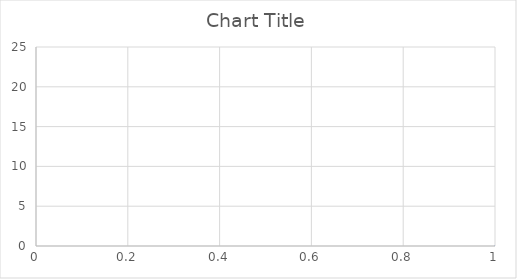
| Category | Series 0 |
|---|---|
| 0 | 0 |
| 1 | 19.247 |
| 2 | 19.247 |
| 3 | 19.247 |
| 4 | 19.248 |
| 5 | 19.25 |
| 6 | 19.25 |
| 7 | 19.251 |
| 8 | 19.252 |
| 9 | 19.252 |
| 10 | 19.249 |
| 11 | 19.247 |
| 12 | 19.241 |
| 13 | 19.245 |
| 14 | 19.249 |
| 15 | 19.249 |
| 16 | 19.249 |
| 17 | 19.249 |
| 18 | 19.249 |
| 19 | 19.249 |
| 20 | 19.249 |
| 21 | 19.249 |
| 22 | 19.249 |
| 23 | 19.249 |
| 24 | 19.249 |
| 25 | 19.249 |
| 26 | 19.249 |
| 27 | 19.25 |
| 28 | 19.251 |
| 29 | 19.251 |
| 30 | 19.249 |
| 31 | 19.246 |
| 32 | 19.246 |
| 33 | 19.25 |
| 34 | 19.254 |
| 35 | 19.248 |
| 36 | 19.248 |
| 37 | 19.248 |
| 38 | 19.251 |
| 39 | 19.254 |
| 40 | 19.257 |
| 41 | 19.249 |
| 42 | 19.248 |
| 43 | 19.247 |
| 44 | 19.252 |
| 45 | 19.251 |
| 46 | 19.25 |
| 47 | 19.25 |
| 48 | 19.25 |
| 49 | 19.25 |
| 50 | 19.248 |
| 51 | 19.247 |
| 52 | 19.255 |
| 53 | 19.252 |
| 54 | 19.25 |
| 55 | 19.25 |
| 56 | 19.251 |
| 57 | 19.252 |
| 58 | 19.252 |
| 59 | 19.252 |
| 60 | 19.252 |
| 61 | 19.252 |
| 62 | 19.252 |
| 63 | 19.252 |
| 64 | 19.247 |
| 65 | 19.248 |
| 66 | 19.249 |
| 67 | 19.249 |
| 68 | 19.249 |
| 69 | 19.249 |
| 70 | 19.251 |
| 71 | 19.251 |
| 72 | 19.251 |
| 73 | 19.251 |
| 74 | 19.251 |
| 75 | 19.251 |
| 76 | 19.252 |
| 77 | 19.254 |
| 78 | 19.254 |
| 79 | 19.254 |
| 80 | 19.254 |
| 81 | 19.254 |
| 82 | 19.254 |
| 83 | 19.254 |
| 84 | 19.254 |
| 85 | 19.254 |
| 86 | 19.254 |
| 87 | 19.254 |
| 88 | 19.251 |
| 89 | 19.248 |
| 90 | 19.248 |
| 91 | 19.25 |
| 92 | 19.251 |
| 93 | 19.251 |
| 94 | 19.251 |
| 95 | 19.251 |
| 96 | 19.251 |
| 97 | 19.251 |
| 98 | 19.251 |
| 99 | 19.248 |
| 100 | 19.245 |
| 101 | 19.251 |
| 102 | 19.251 |
| 103 | 19.251 |
| 104 | 19.251 |
| 105 | 19.251 |
| 106 | 19.251 |
| 107 | 19.251 |
| 108 | 19.251 |
| 109 | 19.251 |
| 110 | 19.251 |
| 111 | 19.251 |
| 112 | 19.245 |
| 113 | 19.248 |
| 114 | 19.249 |
| 115 | 19.25 |
| 116 | 19.253 |
| 117 | 19.25 |
| 118 | 19.247 |
| 119 | 19.245 |
| 120 | 19.246 |
| 121 | 19.247 |
| 122 | 19.249 |
| 123 | 19.248 |
| 124 | 19.247 |
| 125 | 19.248 |
| 126 | 19.249 |
| 127 | 19.252 |
| 128 | 19.249 |
| 129 | 19.246 |
| 130 | 19.249 |
| 131 | 19.246 |
| 132 | 19.244 |
| 133 | 19.246 |
| 134 | 19.246 |
| 135 | 19.246 |
| 136 | 19.249 |
| 137 | 19.249 |
| 138 | 19.249 |
| 139 | 19.246 |
| 140 | 19.247 |
| 141 | 19.249 |
| 142 | 19.251 |
| 143 | 19.249 |
| 144 | 19.246 |
| 145 | 19.246 |
| 146 | 19.246 |
| 147 | 19.246 |
| 148 | 19.249 |
| 149 | 19.249 |
| 150 | 19.249 |
| 151 | 19.25 |
| 152 | 19.251 |
| 153 | 19.246 |
| 154 | 19.246 |
| 155 | 19.246 |
| 156 | 19.241 |
| 157 | 19.248 |
| 158 | 19.248 |
| 159 | 19.248 |
| 160 | 19.251 |
| 161 | 19.254 |
| 162 | 19.246 |
| 163 | 19.246 |
| 164 | 19.246 |
| 165 | 19.246 |
| 166 | 19.246 |
| 167 | 19.246 |
| 168 | 19.246 |
| 169 | 19.247 |
| 170 | 19.248 |
| 171 | 19.243 |
| 172 | 19.245 |
| 173 | 19.246 |
| 174 | 19.249 |
| 175 | 19.249 |
| 176 | 19.249 |
| 177 | 19.25 |
| 178 | 19.251 |
| 179 | 19.246 |
| 180 | 19.247 |
| 181 | 19.249 |
| 182 | 19.244 |
| 183 | 19.247 |
| 184 | 19.251 |
| 185 | 19.246 |
| 186 | 19.244 |
| 187 | 19.241 |
| 188 | 19.249 |
| 189 | 19.246 |
| 190 | 19.244 |
| 191 | 19.244 |
| 192 | 19.244 |
| 193 | 19.244 |
| 194 | 19.246 |
| 195 | 19.246 |
| 196 | 19.246 |
| 197 | 19.246 |
| 198 | 19.245 |
| 199 | 19.244 |
| 200 | 19.239 |
| 201 | 19.242 |
| 202 | 19.246 |
| 203 | 19.246 |
| 204 | 19.246 |
| 205 | 19.246 |
| 206 | 19.246 |
| 207 | 19.246 |
| 208 | 19.239 |
| 209 | 19.245 |
| 210 | 19.251 |
| 211 | 19.251 |
| 212 | 19.249 |
| 213 | 19.246 |
| 214 | 19.246 |
| 215 | 19.249 |
| 216 | 19.252 |
| 217 | 19.244 |
| 218 | 19.244 |
| 219 | 19.244 |
| 220 | 19.251 |
| 221 | 19.249 |
| 222 | 19.246 |
| 223 | 19.246 |
| 224 | 19.248 |
| 225 | 19.249 |
| 226 | 19.244 |
| 227 | 19.244 |
| 228 | 19.244 |
| 229 | 19.245 |
| 230 | 19.247 |
| 231 | 19.249 |
| 232 | 19.249 |
| 233 | 19.249 |
| 234 | 19.252 |
| 235 | 19.25 |
| 236 | 19.247 |
| 237 | 19.255 |
| 238 | 19.252 |
| 239 | 19.25 |
| 240 | 19.25 |
| 241 | 19.25 |
| 242 | 19.25 |
| 243 | 19.25 |
| 244 | 19.25 |
| 245 | 19.25 |
| 246 | 19.25 |
| 247 | 19.246 |
| 248 | 19.242 |
| 249 | 19.242 |
| 250 | 19.246 |
| 251 | 19.25 |
| 252 | 19.25 |
| 253 | 19.25 |
| 254 | 19.25 |
| 255 | 19.25 |
| 256 | 19.25 |
| 257 | 19.245 |
| 258 | 19.245 |
| 259 | 19.245 |
| 260 | 19.252 |
| 261 | 19.252 |
| 262 | 19.252 |
| 263 | 19.252 |
| 264 | 19.252 |
| 265 | 19.252 |
| 266 | 19.245 |
| 267 | 19.247 |
| 268 | 19.25 |
| 269 | 19.25 |
| 270 | 19.25 |
| 271 | 19.25 |
| 272 | 19.252 |
| 273 | 19.252 |
| 274 | 19.252 |
| 275 | 19.249 |
| 276 | 19.249 |
| 277 | 19.249 |
| 278 | 19.247 |
| 279 | 19.247 |
| 280 | 19.247 |
| 281 | 19.247 |
| 282 | 19.247 |
| 283 | 19.249 |
| 284 | 19.249 |
| 285 | 19.249 |
| 286 | 19.252 |
| 287 | 19.249 |
| 288 | 19.247 |
| 289 | 19.25 |
| 290 | 19.25 |
| 291 | 19.25 |
| 292 | 19.25 |
| 293 | 19.247 |
| 294 | 19.245 |
| 295 | 19.252 |
| 296 | 19.25 |
| 297 | 19.247 |
| 298 | 19.247 |
| 299 | 19.245 |
| 300 | 19.242 |
| 301 | 19.25 |
| 302 | 19.25 |
| 303 | 19.25 |
| 304 | 19.248 |
| 305 | 19.245 |
| 306 | 19.245 |
| 307 | 19.246 |
| 308 | 19.248 |
| 309 | 19.248 |
| 310 | 19.251 |
| 311 | 19.251 |
| 312 | 19.25 |
| 313 | 19.25 |
| 314 | 19.25 |
| 315 | 19.243 |
| 316 | 19.245 |
| 317 | 19.248 |
| 318 | 19.248 |
| 319 | 19.248 |
| 320 | 19.248 |
| 321 | 19.245 |
| 322 | 19.245 |
| 323 | 19.245 |
| 324 | 19.25 |
| 325 | 19.25 |
| 326 | 19.242 |
| 327 | 19.255 |
| 328 | 19.253 |
| 329 | 19.25 |
| 330 | 19.253 |
| 331 | 19.255 |
| 332 | 19.25 |
| 333 | 19.247 |
| 334 | 19.245 |
| 335 | 19.248 |
| 336 | 19.248 |
| 337 | 19.248 |
| 338 | 19.251 |
| 339 | 19.248 |
| 340 | 19.245 |
| 341 | 19.245 |
| 342 | 19.245 |
| 343 | 19.245 |
| 344 | 19.245 |
| 345 | 19.245 |
| 346 | 19.245 |
| 347 | 19.245 |
| 348 | 19.245 |
| 349 | 19.245 |
| 350 | 19.25 |
| 351 | 19.25 |
| 352 | 19.25 |
| 353 | 19.25 |
| 354 | 19.25 |
| 355 | 19.25 |
| 356 | 19.249 |
| 357 | 19.248 |
| 358 | 19.243 |
| 359 | 19.247 |
| 360 | 19.25 |
| 361 | 19.25 |
| 362 | 19.25 |
| 363 | 19.25 |
| 364 | 19.25 |
| 365 | 19.247 |
| 366 | 19.243 |
| 367 | 19.248 |
| 368 | 19.246 |
| 369 | 19.245 |
| 370 | 19.25 |
| 371 | 19.249 |
| 372 | 19.247 |
| 373 | 19.252 |
| 374 | 19.251 |
| 375 | 19.25 |
| 376 | 19.255 |
| 377 | 19.253 |
| 378 | 19.252 |
| 379 | 19.249 |
| 380 | 19.248 |
| 381 | 19.247 |
| 382 | 19.249 |
| 383 | 19.252 |
| 384 | 19.244 |
| 385 | 19.245 |
| 386 | 19.246 |
| 387 | 19.251 |
| 388 | 19.251 |
| 389 | 19.251 |
| 390 | 19.254 |
| 391 | 19.252 |
| 392 | 19.249 |
| 393 | 19.249 |
| 394 | 19.249 |
| 395 | 19.249 |
| 396 | 19.249 |
| 397 | 19.246 |
| 398 | 19.244 |
| 399 | 19.252 |
| 400 | 19.252 |
| 401 | 19.252 |
| 402 | 19.247 |
| 403 | 19.249 |
| 404 | 19.252 |
| 405 | 19.252 |
| 406 | 19.252 |
| 407 | 19.252 |
| 408 | 19.252 |
| 409 | 19.252 |
| 410 | 19.252 |
| 411 | 19.25 |
| 412 | 19.249 |
| 413 | 19.249 |
| 414 | 19.252 |
| 415 | 19.254 |
| 416 | 19.252 |
| 417 | 19.252 |
| 418 | 19.251 |
| 419 | 19.246 |
| 420 | 19.246 |
| 421 | 19.246 |
| 422 | 19.249 |
| 423 | 19.246 |
| 424 | 19.244 |
| 425 | 19.252 |
| 426 | 19.249 |
| 427 | 19.247 |
| 428 | 19.249 |
| 429 | 19.249 |
| 430 | 19.249 |
| 431 | 19.249 |
| 432 | 19.251 |
| 433 | 19.252 |
| 434 | 19.252 |
| 435 | 19.252 |
| 436 | 19.247 |
| 437 | 19.251 |
| 438 | 19.255 |
| 439 | 19.25 |
| 440 | 19.25 |
| 441 | 19.25 |
| 442 | 19.252 |
| 443 | 19.252 |
| 444 | 19.252 |
| 445 | 19.255 |
| 446 | 19.253 |
| 447 | 19.25 |
| 448 | 19.245 |
| 449 | 19.246 |
| 450 | 19.248 |
| 451 | 19.248 |
| 452 | 19.249 |
| 453 | 19.251 |
| 454 | 19.25 |
| 455 | 19.248 |
| 456 | 19.245 |
| 457 | 19.253 |
| 458 | 19.251 |
| 459 | 19.248 |
| 460 | 19.248 |
| 461 | 19.248 |
| 462 | 19.251 |
| 463 | 19.249 |
| 464 | 19.246 |
| 465 | 19.254 |
| 466 | 19.251 |
| 467 | 19.249 |
| 468 | 19.252 |
| 469 | 19.252 |
| 470 | 19.252 |
| 471 | 19.254 |
| 472 | 19.252 |
| 473 | 19.249 |
| 474 | 19.249 |
| 475 | 19.247 |
| 476 | 19.244 |
| 477 | 19.252 |
| 478 | 19.25 |
| 479 | 19.247 |
| 480 | 19.25 |
| 481 | 19.25 |
| 482 | 19.25 |
| 483 | 19.253 |
| 484 | 19.253 |
| 485 | 19.253 |
| 486 | 19.248 |
| 487 | 19.249 |
| 488 | 19.251 |
| 489 | 19.248 |
| 490 | 19.246 |
| 491 | 19.254 |
| 492 | 19.254 |
| 493 | 19.254 |
| 494 | 19.249 |
| 495 | 19.249 |
| 496 | 19.249 |
| 497 | 19.252 |
| 498 | 19.249 |
| 499 | 19.247 |
| 500 | 19.257 |
| 501 | 19.255 |
| 502 | 19.252 |
| 503 | 19.247 |
| 504 | 19.249 |
| 505 | 19.25 |
| 506 | 19.253 |
| 507 | 19.251 |
| 508 | 19.248 |
| 509 | 19.248 |
| 510 | 19.248 |
| 511 | 19.248 |
| 512 | 19.256 |
| 513 | 19.252 |
| 514 | 19.248 |
| 515 | 19.25 |
| 516 | 19.251 |
| 517 | 19.251 |
| 518 | 19.251 |
| 519 | 19.251 |
| 520 | 19.251 |
| 521 | 19.25 |
| 522 | 19.249 |
| 523 | 19.249 |
| 524 | 19.248 |
| 525 | 19.247 |
| 526 | 19.25 |
| 527 | 19.252 |
| 528 | 19.253 |
| 529 | 19.251 |
| 530 | 19.249 |
| 531 | 19.246 |
| 532 | 19.254 |
| 533 | 19.252 |
| 534 | 19.249 |
| 535 | 19.245 |
| 536 | 19.249 |
| 537 | 19.253 |
| 538 | 19.253 |
| 539 | 19.25 |
| 540 | 19.248 |
| 541 | 19.246 |
| 542 | 19.245 |
| 543 | 19.25 |
| 544 | 19.25 |
| 545 | 19.25 |
| 546 | 19.249 |
| 547 | 19.249 |
| 548 | 19.249 |
| 549 | 19.25 |
| 550 | 19.25 |
| 551 | 19.25 |
| 552 | 19.25 |
| 553 | 19.247 |
| 554 | 19.245 |
| 555 | 19.245 |
| 556 | 19.245 |
| 557 | 19.245 |
| 558 | 19.245 |
| 559 | 19.246 |
| 560 | 19.248 |
| 561 | 19.248 |
| 562 | 19.249 |
| 563 | 19.251 |
| 564 | 19.251 |
| 565 | 19.251 |
| 566 | 19.251 |
| 567 | 19.251 |
| 568 | 19.251 |
| 569 | 19.246 |
| 570 | 19.246 |
| 571 | 19.246 |
| 572 | 19.249 |
| 573 | 19.25 |
| 574 | 19.252 |
| 575 | 19.255 |
| 576 | 19.251 |
| 577 | 19.247 |
| 578 | 19.25 |
| 579 | 19.248 |
| 580 | 19.245 |
| 581 | 19.245 |
| 582 | 19.249 |
| 583 | 19.253 |
| 584 | 19.253 |
| 585 | 19.249 |
| 586 | 19.245 |
| 587 | 19.248 |
| 588 | 19.247 |
| 589 | 19.245 |
| 590 | 19.253 |
| 591 | 19.251 |
| 592 | 19.248 |
| 593 | 19.248 |
| 594 | 19.248 |
| 595 | 19.253 |
| 596 | 19.249 |
| 597 | 19.245 |
| 598 | 19.25 |
| 599 | 19.25 |
| 600 | 19.25 |
| 601 | 19.247 |
| 602 | 19.247 |
| 603 | 19.247 |
| 604 | 19.244 |
| 605 | 19.244 |
| 606 | 19.244 |
| 607 | 19.249 |
| 608 | 19.247 |
| 609 | 19.246 |
| 610 | 19.246 |
| 611 | 19.248 |
| 612 | 19.251 |
| 613 | 19.251 |
| 614 | 19.249 |
| 615 | 19.248 |
| 616 | 19.245 |
| 617 | 19.247 |
| 618 | 19.249 |
| 619 | 19.249 |
| 620 | 19.249 |
| 621 | 19.25 |
| 622 | 19.248 |
| 623 | 19.247 |
| 624 | 19.251 |
| 625 | 19.25 |
| 626 | 19.248 |
| 627 | 19.245 |
| 628 | 19.248 |
| 629 | 19.25 |
| 630 | 19.242 |
| 631 | 19.242 |
| 632 | 19.252 |
| 633 | 19.252 |
| 634 | 19.252 |
| 635 | 19.252 |
| 636 | 19.247 |
| 637 | 19.247 |
| 638 | 19.247 |
| 639 | 19.242 |
| 640 | 19.246 |
| 641 | 19.25 |
| 642 | 19.25 |
| 643 | 19.25 |
| 644 | 19.25 |
| 645 | 19.25 |
| 646 | 19.25 |
| 647 | 19.25 |
| 648 | 19.25 |
| 649 | 19.25 |
| 650 | 19.25 |
| 651 | 19.252 |
| 652 | 19.253 |
| 653 | 19.248 |
| 654 | 19.246 |
| 655 | 19.243 |
| 656 | 19.246 |
| 657 | 19.248 |
| 658 | 19.25 |
| 659 | 19.253 |
| 660 | 19.252 |
| 661 | 19.251 |
| 662 | 19.254 |
| 663 | 19.253 |
| 664 | 19.252 |
| 665 | 19.253 |
| 666 | 19.252 |
| 667 | 19.252 |
| 668 | 19.245 |
| 669 | 19.248 |
| 670 | 19.251 |
| 671 | 17.441 |
| 672 | 15.631 |
| 673 | 15.753 |
| 674 | 16.28 |
| 675 | 16.808 |
| 676 | 18.602 |
| 677 | 18.664 |
| 678 | 18.726 |
| 679 | 18.838 |
| 680 | 18.876 |
| 681 | 18.915 |
| 682 | 18.978 |
| 683 | 19.002 |
| 684 | 19.025 |
| 685 | 19.062 |
| 686 | 19.077 |
| 687 | 19.092 |
| 688 | 19.118 |
| 689 | 19.127 |
| 690 | 19.136 |
| 691 | 19.156 |
| 692 | 19.156 |
| 693 | 19.175 |
| 694 | 19.196 |
| 695 | 19.199 |
| 696 | 19.202 |
| 697 | 19.211 |
| 698 | 19.219 |
| 699 | 19.235 |
| 700 | 19.237 |
| 701 | 19.238 |
| 702 | 19.246 |
| 703 | 19.247 |
| 704 | 19.248 |
| 705 | 19.252 |
| 706 | 19.25 |
| 707 | 19.248 |
| 708 | 19.258 |
| 709 | 19.254 |
| 710 | 19.249 |
| 711 | 19.251 |
| 712 | 19.25 |
| 713 | 19.248 |
| 714 | 19.246 |
| 715 | 19.241 |
| 716 | 19.236 |
| 717 | 19.239 |
| 718 | 19.24 |
| 719 | 19.241 |
| 720 | 19.232 |
| 721 | 19.232 |
| 722 | 19.232 |
| 723 | 19.226 |
| 724 | 19.229 |
| 725 | 19.231 |
| 726 | 19.229 |
| 727 | 19.227 |
| 728 | 19.231 |
| 729 | 19.231 |
| 730 | 19.231 |
| 731 | 19.235 |
| 732 | 19.233 |
| 733 | 19.232 |
| 734 | 19.233 |
| 735 | 19.239 |
| 736 | 19.244 |
| 737 | 19.248 |
| 738 | 19.245 |
| 739 | 19.243 |
| 740 | 19.244 |
| 741 | 19.245 |
| 742 | 19.246 |
| 743 | 19.243 |
| 744 | 19.246 |
| 745 | 19.249 |
| 746 | 19.241 |
| 747 | 19.243 |
| 748 | 19.244 |
| 749 | 19.239 |
| 750 | 19.242 |
| 751 | 19.245 |
| 752 | 19.248 |
| 753 | 19.251 |
| 754 | 19.254 |
| 755 | 19.253 |
| 756 | 19.252 |
| 757 | 19.252 |
| 758 | 19.253 |
| 759 | 19.255 |
| 760 | 19.255 |
| 761 | 19.26 |
| 762 | 19.264 |
| 763 | 19.257 |
| 764 | 19.257 |
| 765 | 19.258 |
| 766 | 19.254 |
| 767 | 19.256 |
| 768 | 19.259 |
| 769 | 19.254 |
| 770 | 19.254 |
| 771 | 19.254 |
| 772 | 19.254 |
| 773 | 19.256 |
| 774 | 19.258 |
| 775 | 19.25 |
| 776 | 19.252 |
| 777 | 19.254 |
| 778 | 19.252 |
| 779 | 19.25 |
| 780 | 19.259 |
| 781 | 19.26 |
| 782 | 19.26 |
| 783 | 19.261 |
| 784 | 19.262 |
| 785 | 19.262 |
| 786 | 19.259 |
| 787 | 19.263 |
| 788 | 19.267 |
| 789 | 19.262 |
| 790 | 19.264 |
| 791 | 19.266 |
| 792 | 19.257 |
| 793 | 19.258 |
| 794 | 19.26 |
| 795 | 19.256 |
| 796 | 19.258 |
| 797 | 19.26 |
| 798 | 19.265 |
| 799 | 19.265 |
| 800 | 19.266 |
| 801 | 19.262 |
| 802 | 19.262 |
| 803 | 19.262 |
| 804 | 19.264 |
| 805 | 19.267 |
| 806 | 19.267 |
| 807 | 19.266 |
| 808 | 19.266 |
| 809 | 19.265 |
| 810 | 19.266 |
| 811 | 19.267 |
| 812 | 19.266 |
| 813 | 19.267 |
| 814 | 19.269 |
| 815 | 19.268 |
| 816 | 19.268 |
| 817 | 19.267 |
| 818 | 19.266 |
| 819 | 19.264 |
| 820 | 19.262 |
| 821 | 19.262 |
| 822 | 19.262 |
| 823 | 19.262 |
| 824 | 19.262 |
| 825 | 19.262 |
| 826 | 19.262 |
| 827 | 19.266 |
| 828 | 19.265 |
| 829 | 19.265 |
| 830 | 19.268 |
| 831 | 19.268 |
| 832 | 19.259 |
| 833 | 19.262 |
| 834 | 19.266 |
| 835 | 19.265 |
| 836 | 19.268 |
| 837 | 19.272 |
| 838 | 19.267 |
| 839 | 19.267 |
| 840 | 19.267 |
| 841 | 19.266 |
| 842 | 19.268 |
| 843 | 19.27 |
| 844 | 19.266 |
| 845 | 19.266 |
| 846 | 19.266 |
| 847 | 19.27 |
| 848 | 19.27 |
| 849 | 19.271 |
| 850 | 19.267 |
| 851 | 19.267 |
| 852 | 19.267 |
| 853 | 19.271 |
| 854 | 19.271 |
| 855 | 19.271 |
| 856 | 19.269 |
| 857 | 19.267 |
| 858 | 19.275 |
| 859 | 19.273 |
| 860 | 19.271 |
| 861 | 19.274 |
| 862 | 19.274 |
| 863 | 19.275 |
| 864 | 19.279 |
| 865 | 19.279 |
| 866 | 19.279 |
| 867 | 19.279 |
| 868 | 19.276 |
| 869 | 19.274 |
| 870 | 19.274 |
| 871 | 19.278 |
| 872 | 19.282 |
| 873 | 19.274 |
| 874 | 19.274 |
| 875 | 19.274 |
| 876 | 19.274 |
| 877 | 19.276 |
| 878 | 19.279 |
| 879 | 19.274 |
| 880 | 19.278 |
| 881 | 19.282 |
| 882 | 19.282 |
| 883 | 19.28 |
| 884 | 19.278 |
| 885 | 19.282 |
| 886 | 19.286 |
| 887 | 19.278 |
| 888 | 19.28 |
| 889 | 19.282 |
| 890 | 19.282 |
| 891 | 19.279 |
| 892 | 19.277 |
| 893 | 19.281 |
| 894 | 19.281 |
| 895 | 19.281 |
| 896 | 19.285 |
| 897 | 19.283 |
| 898 | 19.281 |
| 899 | 19.285 |
| 900 | 19.285 |
| 901 | 19.285 |
| 902 | 19.285 |
| 903 | 19.287 |
| 904 | 19.289 |
| 905 | 19.285 |
| 906 | 19.285 |
| 907 | 19.284 |
| 908 | 19.293 |
| 909 | 19.29 |
| 910 | 19.288 |
| 911 | 19.29 |
| 912 | 19.292 |
| 913 | 19.292 |
| 914 | 19.29 |
| 915 | 19.288 |
| 916 | 19.288 |
| 917 | 19.288 |
| 918 | 19.288 |
| 919 | 19.292 |
| 920 | 19.29 |
| 921 | 19.288 |
| 922 | 19.292 |
| 923 | 19.294 |
| 924 | 19.297 |
| 925 | 19.292 |
| 926 | 19.292 |
| 927 | 19.292 |
| 928 | 19.292 |
| 929 | 19.29 |
| 930 | 19.288 |
| 931 | 19.288 |
| 932 | 19.288 |
| 933 | 19.288 |
| 934 | 19.289 |
| 935 | 19.289 |
| 936 | 19.289 |
| 937 | 19.287 |
| 938 | 19.285 |
| 939 | 19.293 |
| 940 | 19.289 |
| 941 | 19.285 |
| 942 | 19.285 |
| 943 | 19.289 |
| 944 | 19.293 |
| 945 | 19.293 |
| 946 | 19.291 |
| 947 | 19.288 |
| 948 | 19.297 |
| 949 | 19.292 |
| 950 | 19.288 |
| 951 | 19.297 |
| 952 | 19.299 |
| 953 | 19.301 |
| 954 | 19.293 |
| 955 | 19.293 |
| 956 | 19.293 |
| 957 | 19.293 |
| 958 | 19.295 |
| 959 | 19.297 |
| 960 | 19.297 |
| 961 | 19.297 |
| 962 | 19.297 |
| 963 | 19.297 |
| 964 | 19.298 |
| 965 | 19.293 |
| 966 | 19.293 |
| 967 | 19.293 |
| 968 | 19.301 |
| 969 | 19.297 |
| 970 | 19.293 |
| 971 | 19.301 |
| 972 | 19.299 |
| 973 | 19.296 |
| 974 | 19.296 |
| 975 | 19.296 |
| 976 | 19.296 |
| 977 | 19.305 |
| 978 | 19.303 |
| 979 | 19.301 |
| 980 | 19.3 |
| 981 | 19.298 |
| 982 | 19.296 |
| 983 | 19.296 |
| 984 | 19.299 |
| 985 | 19.301 |
| 986 | 19.301 |
| 987 | 19.303 |
| 988 | 19.305 |
| 989 | 19.303 |
| 990 | 19.301 |
| 991 | 19.301 |
| 992 | 19.299 |
| 993 | 19.297 |
| 994 | 19.301 |
| 995 | 19.303 |
| 996 | 19.305 |
| 997 | 19.305 |
| 998 | 19.305 |
| 999 | 19.305 |
| 1000 | 19.309 |
| 1001 | 19.307 |
| 1002 | 19.305 |
| 1003 | 19.305 |
| 1004 | 19.303 |
| 1005 | 19.301 |
| 1006 | 19.313 |
| 1007 | 19.311 |
| 1008 | 19.309 |
| 1009 | 19.305 |
| 1010 | 19.305 |
| 1011 | 19.305 |
| 1012 | 19.309 |
| 1013 | 19.307 |
| 1014 | 19.305 |
| 1015 | 19.307 |
| 1016 | 19.309 |
| 1017 | 19.309 |
| 1018 | 19.309 |
| 1019 | 19.309 |
| 1020 | 19.305 |
| 1021 | 19.307 |
| 1022 | 19.309 |
| 1023 | 19.309 |
| 1024 | 19.311 |
| 1025 | 19.313 |
| 1026 | 19.313 |
| 1027 | 19.315 |
| 1028 | 19.317 |
| 1029 | 19.309 |
| 1030 | 19.309 |
| 1031 | 19.309 |
| 1032 | 19.31 |
| 1033 | 19.31 |
| 1034 | 19.31 |
| 1035 | 19.314 |
| 1036 | 19.314 |
| 1037 | 19.314 |
| 1038 | 19.31 |
| 1039 | 19.31 |
| 1040 | 19.311 |
| 1041 | 19.315 |
| 1042 | 19.319 |
| 1043 | 19.311 |
| 1044 | 19.312 |
| 1045 | 19.312 |
| 1046 | 19.312 |
| 1047 | 19.312 |
| 1048 | 19.312 |
| 1049 | 19.312 |
| 1050 | 19.314 |
| 1051 | 19.316 |
| 1052 | 19.312 |
| 1053 | 19.314 |
| 1054 | 19.316 |
| 1055 | 19.316 |
| 1056 | 19.314 |
| 1057 | 19.312 |
| 1058 | 19.316 |
| 1059 | 19.318 |
| 1060 | 19.321 |
| 1061 | 19.317 |
| 1062 | 19.317 |
| 1063 | 19.317 |
| 1064 | 19.309 |
| 1065 | 19.311 |
| 1066 | 19.314 |
| 1067 | 19.312 |
| 1068 | 19.31 |
| 1069 | 19.31 |
| 1070 | 19.312 |
| 1071 | 19.314 |
| 1072 | 19.319 |
| 1073 | 19.317 |
| 1074 | 19.315 |
| 1075 | 19.311 |
| 1076 | 19.313 |
| 1077 | 19.316 |
| 1078 | 19.316 |
| 1079 | 19.314 |
| 1080 | 19.312 |
| 1081 | 19.308 |
| 1082 | 19.312 |
| 1083 | 19.316 |
| 1084 | 19.316 |
| 1085 | 19.316 |
| 1086 | 19.316 |
| 1087 | 19.312 |
| 1088 | 19.312 |
| 1089 | 19.312 |
| 1090 | 19.316 |
| 1091 | 19.316 |
| 1092 | 19.316 |
| 1093 | 19.316 |
| 1094 | 19.316 |
| 1095 | 19.316 |
| 1096 | 19.315 |
| 1097 | 19.315 |
| 1098 | 19.315 |
| 1099 | 19.315 |
| 1100 | 19.315 |
| 1101 | 19.315 |
| 1102 | 19.317 |
| 1103 | 19.319 |
| 1104 | 19.319 |
| 1105 | 19.321 |
| 1106 | 19.323 |
| 1107 | 19.319 |
| 1108 | 19.319 |
| 1109 | 19.319 |
| 1110 | 19.327 |
| 1111 | 19.323 |
| 1112 | 19.319 |
| 1113 | 19.319 |
| 1114 | 19.321 |
| 1115 | 19.323 |
| 1116 | 19.323 |
| 1117 | 19.323 |
| 1118 | 19.323 |
| 1119 | 19.327 |
| 1120 | 19.331 |
| 1121 | 19.323 |
| 1122 | 19.327 |
| 1123 | 19.331 |
| 1124 | 19.323 |
| 1125 | 19.325 |
| 1126 | 19.327 |
| 1127 | 19.327 |
| 1128 | 19.327 |
| 1129 | 19.327 |
| 1130 | 19.327 |
| 1131 | 19.327 |
| 1132 | 19.327 |
| 1133 | 19.327 |
| 1134 | 19.329 |
| 1135 | 19.331 |
| 1136 | 19.326 |
| 1137 | 19.324 |
| 1138 | 19.322 |
| 1139 | 19.318 |
| 1140 | 19.322 |
| 1141 | 19.326 |
| 1142 | 19.321 |
| 1143 | 19.323 |
| 1144 | 19.325 |
| 1145 | 19.327 |
| 1146 | 19.329 |
| 1147 | 19.325 |
| 1148 | 19.327 |
| 1149 | 19.329 |
| 1150 | 19.324 |
| 1151 | 19.324 |
| 1152 | 19.324 |
| 1153 | 19.333 |
| 1154 | 19.331 |
| 1155 | 19.329 |
| 1156 | 19.333 |
| 1157 | 19.331 |
| 1158 | 19.329 |
| 1159 | 19.329 |
| 1160 | 19.329 |
| 1161 | 19.329 |
| 1162 | 19.329 |
| 1163 | 19.331 |
| 1164 | 19.333 |
| 1165 | 19.329 |
| 1166 | 19.332 |
| 1167 | 19.334 |
| 1168 | 19.33 |
| 1169 | 19.332 |
| 1170 | 19.334 |
| 1171 | 19.33 |
| 1172 | 19.331 |
| 1173 | 19.331 |
| 1174 | 19.329 |
| 1175 | 19.327 |
| 1176 | 19.336 |
| 1177 | 19.336 |
| 1178 | 19.336 |
| 1179 | 19.332 |
| 1180 | 19.333 |
| 1181 | 19.333 |
| 1182 | 19.338 |
| 1183 | 19.336 |
| 1184 | 19.334 |
| 1185 | 19.338 |
| 1186 | 19.336 |
| 1187 | 19.334 |
| 1188 | 19.335 |
| 1189 | 19.337 |
| 1190 | 19.339 |
| 1191 | 19.34 |
| 1192 | 19.336 |
| 1193 | 19.332 |
| 1194 | 19.338 |
| 1195 | 19.336 |
| 1196 | 19.335 |
| 1197 | 19.34 |
| 1198 | 19.336 |
| 1199 | 19.332 |
| 1200 | 19.335 |
| 1201 | 19.337 |
| 1202 | 19.329 |
| 1203 | 19.332 |
| 1204 | 19.334 |
| 1205 | 19.339 |
| 1206 | 19.335 |
| 1207 | 19.331 |
| 1208 | 19.336 |
| 1209 | 19.336 |
| 1210 | 19.337 |
| 1211 | 19.338 |
| 1212 | 19.34 |
| 1213 | 19.343 |
| 1214 | 19.336 |
| 1215 | 19.338 |
| 1216 | 19.341 |
| 1217 | 19.337 |
| 1218 | 19.339 |
| 1219 | 19.342 |
| 1220 | 19.338 |
| 1221 | 19.338 |
| 1222 | 19.339 |
| 1223 | 19.344 |
| 1224 | 19.342 |
| 1225 | 19.34 |
| 1226 | 19.343 |
| 1227 | 19.345 |
| 1228 | 19.341 |
| 1229 | 19.339 |
| 1230 | 19.338 |
| 1231 | 19.341 |
| 1232 | 19.341 |
| 1233 | 19.341 |
| 1234 | 19.345 |
| 1235 | 19.345 |
| 1236 | 19.345 |
| 1237 | 19.345 |
| 1238 | 19.343 |
| 1239 | 19.34 |
| 1240 | 19.344 |
| 1241 | 19.344 |
| 1242 | 19.344 |
| 1243 | 19.344 |
| 1244 | 19.341 |
| 1245 | 19.339 |
| 1246 | 19.346 |
| 1247 | 19.342 |
| 1248 | 19.338 |
| 1249 | 19.342 |
| 1250 | 19.342 |
| 1251 | 19.342 |
| 1252 | 19.344 |
| 1253 | 19.345 |
| 1254 | 19.341 |
| 1255 | 19.341 |
| 1256 | 19.341 |
| 1257 | 19.344 |
| 1258 | 19.342 |
| 1259 | 19.34 |
| 1260 | 19.344 |
| 1261 | 19.347 |
| 1262 | 19.349 |
| 1263 | 19.349 |
| 1264 | 19.349 |
| 1265 | 19.349 |
| 1266 | 19.341 |
| 1267 | 19.343 |
| 1268 | 19.345 |
| 1269 | 19.349 |
| 1270 | 19.345 |
| 1271 | 19.341 |
| 1272 | 19.344 |
| 1273 | 19.346 |
| 1274 | 19.348 |
| 1275 | 19.348 |
| 1276 | 19.348 |
| 1277 | 19.348 |
| 1278 | 19.344 |
| 1279 | 19.34 |
| 1280 | 19.34 |
| 1281 | 19.341 |
| 1282 | 19.343 |
| 1283 | 19.347 |
| 1284 | 19.349 |
| 1285 | 19.351 |
| 1286 | 19.342 |
| 1287 | 19.346 |
| 1288 | 19.35 |
| 1289 | 19.345 |
| 1290 | 19.343 |
| 1291 | 19.341 |
| 1292 | 19.348 |
| 1293 | 19.344 |
| 1294 | 19.34 |
| 1295 | 19.343 |
| 1296 | 19.345 |
| 1297 | 19.347 |
| 1298 | 19.347 |
| 1299 | 19.345 |
| 1300 | 19.343 |
| 1301 | 19.346 |
| 1302 | 19.348 |
| 1303 | 19.35 |
| 1304 | 19.346 |
| 1305 | 19.342 |
| 1306 | 19.345 |
| 1307 | 19.345 |
| 1308 | 19.345 |
| 1309 | 19.345 |
| 1310 | 19.345 |
| 1311 | 19.346 |
| 1312 | 19.349 |
| 1313 | 19.349 |
| 1314 | 19.349 |
| 1315 | 19.345 |
| 1316 | 19.347 |
| 1317 | 19.349 |
| 1318 | 19.349 |
| 1319 | 19.349 |
| 1320 | 19.349 |
| 1321 | 19.345 |
| 1322 | 19.348 |
| 1323 | 19.35 |
| 1324 | 19.351 |
| 1325 | 19.349 |
| 1326 | 19.347 |
| 1327 | 19.352 |
| 1328 | 19.348 |
| 1329 | 19.344 |
| 1330 | 19.347 |
| 1331 | 19.349 |
| 1332 | 19.354 |
| 1333 | 19.352 |
| 1334 | 19.35 |
| 1335 | 19.342 |
| 1336 | 19.345 |
| 1337 | 19.347 |
| 1338 | 19.348 |
| 1339 | 19.349 |
| 1340 | 19.349 |
| 1341 | 19.35 |
| 1342 | 19.351 |
| 1343 | 19.351 |
| 1344 | 19.352 |
| 1345 | 19.349 |
| 1346 | 19.345 |
| 1347 | 19.346 |
| 1348 | 19.347 |
| 1349 | 19.347 |
| 1350 | 19.348 |
| 1351 | 19.349 |
| 1352 | 19.35 |
| 1353 | 19.351 |
| 1354 | 19.351 |
| 1355 | 19.352 |
| 1356 | 19.353 |
| 1357 | 19.353 |
| 1358 | 19.351 |
| 1359 | 19.35 |
| 1360 | 19.349 |
| 1361 | 19.35 |
| 1362 | 19.349 |
| 1363 | 19.348 |
| 1364 | 19.354 |
| 1365 | 19.352 |
| 1366 | 19.352 |
| 1367 | 19.35 |
| 1368 | 19.351 |
| 1369 | 19.351 |
| 1370 | 19.348 |
| 1371 | 19.35 |
| 1372 | 19.353 |
| 1373 | 19.354 |
| 1374 | 19.353 |
| 1375 | 19.351 |
| 1376 | 19.347 |
| 1377 | 19.35 |
| 1378 | 19.352 |
| 1379 | 19.349 |
| 1380 | 19.347 |
| 1381 | 19.345 |
| 1382 | 19.345 |
| 1383 | 19.345 |
| 1384 | 19.345 |
| 1385 | 19.347 |
| 1386 | 19.349 |
| 1387 | 19.349 |
| 1388 | 19.349 |
| 1389 | 19.349 |
| 1390 | 19.349 |
| 1391 | 19.349 |
| 1392 | 19.349 |
| 1393 | 19.349 |
| 1394 | 19.349 |
| 1395 | 19.349 |
| 1396 | 19.352 |
| 1397 | 19.352 |
| 1398 | 19.352 |
| 1399 | 19.353 |
| 1400 | 19.35 |
| 1401 | 19.347 |
| 1402 | 19.351 |
| 1403 | 19.353 |
| 1404 | 19.354 |
| 1405 | 19.354 |
| 1406 | 19.35 |
| 1407 | 19.346 |
| 1408 | 19.35 |
| 1409 | 19.354 |
| 1410 | 19.355 |
| 1411 | 19.354 |
| 1412 | 19.354 |
| 1413 | 19.347 |
| 1414 | 19.346 |
| 1415 | 19.345 |
| 1416 | 19.356 |
| 1417 | 19.353 |
| 1418 | 19.35 |
| 1419 | 19.352 |
| 1420 | 19.353 |
| 1421 | 19.354 |
| 1422 | 19.355 |
| 1423 | 19.352 |
| 1424 | 19.349 |
| 1425 | 19.347 |
| 1426 | 19.348 |
| 1427 | 19.349 |
| 1428 | 19.354 |
| 1429 | 19.354 |
| 1430 | 19.354 |
| 1431 | 19.354 |
| 1432 | 19.352 |
| 1433 | 19.35 |
| 1434 | 19.349 |
| 1435 | 19.347 |
| 1436 | 19.352 |
| 1437 | 19.351 |
| 1438 | 19.349 |
| 1439 | 19.354 |
| 1440 | 19.355 |
| 1441 | 19.356 |
| 1442 | 19.353 |
| 1443 | 19.351 |
| 1444 | 19.349 |
| 1445 | 19.346 |
| 1446 | 19.35 |
| 1447 | 19.353 |
| 1448 | 19.35 |
| 1449 | 19.353 |
| 1450 | 19.355 |
| 1451 | 19.352 |
| 1452 | 19.35 |
| 1453 | 19.349 |
| 1454 | 19.354 |
| 1455 | 19.367 |
| 1456 | 19.381 |
| 1457 | 19.376 |
| 1458 | 19.363 |
| 1459 | 19.35 |
| 1460 | 19.351 |
| 1461 | 19.352 |
| 1462 | 19.358 |
| 1463 | 19.356 |
| 1464 | 19.354 |
| 1465 | 19.355 |
| 1466 | 19.355 |
| 1467 | 19.355 |
| 1468 | 19.354 |
| 1469 | 19.353 |
| 1470 | 19.352 |
| 1471 | 19.354 |
| 1472 | 19.346 |
| 1473 | 19.346 |
| 1474 | 19.337 |
| 1475 | 19.335 |
| 1476 | 19.334 |
| 1477 | 19.331 |
| 1478 | 19.333 |
| 1479 | 19.334 |
| 1480 | 19.331 |
| 1481 | 19.331 |
| 1482 | 19.331 |
| 1483 | 19.332 |
| 1484 | 19.334 |
| 1485 | 19.337 |
| 1486 | 19.34 |
| 1487 | 19.343 |
| 1488 | 19.34 |
| 1489 | 19.337 |
| 1490 | 19.333 |
| 1491 | 19.337 |
| 1492 | 19.338 |
| 1493 | 19.338 |
| 1494 | 19.341 |
| 1495 | 19.338 |
| 1496 | 19.334 |
| 1497 | 19.342 |
| 1498 | 19.341 |
| 1499 | 19.34 |
| 1500 | 19.347 |
| 1501 | 19.342 |
| 1502 | 19.336 |
| 1503 | 19.335 |
| 1504 | 19.341 |
| 1505 | 19.347 |
| 1506 | 19.347 |
| 1507 | 19.345 |
| 1508 | 19.343 |
| 1509 | 19.347 |
| 1510 | 19.351 |
| 1511 | 19.346 |
| 1512 | 19.348 |
| 1513 | 19.35 |
| 1514 | 19.35 |
| 1515 | 19.343 |
| 1516 | 19.337 |
| 1517 | 19.342 |
| 1518 | 19.344 |
| 1519 | 19.346 |
| 1520 | 19.349 |
| 1521 | 19.35 |
| 1522 | 19.351 |
| 1523 | 19.349 |
| 1524 | 19.35 |
| 1525 | 19.352 |
| 1526 | 19.346 |
| 1527 | 19.347 |
| 1528 | 19.349 |
| 1529 | 19.347 |
| 1530 | 19.346 |
| 1531 | 19.346 |
| 1532 | 19.344 |
| 1533 | 19.349 |
| 1534 | 19.355 |
| 1535 | 19.35 |
| 1536 | 19.345 |
| 1537 | 19.344 |
| 1538 | 19.347 |
| 1539 | 19.351 |
| 1540 | 19.346 |
| 1541 | 19.35 |
| 1542 | 19.355 |
| 1543 | 19.346 |
| 1544 | 19.348 |
| 1545 | 19.351 |
| 1546 | 19.351 |
| 1547 | 19.349 |
| 1548 | 19.347 |
| 1549 | 19.351 |
| 1550 | 19.349 |
| 1551 | 19.347 |
| 1552 | 19.342 |
| 1553 | 19.346 |
| 1554 | 19.351 |
| 1555 | 19.342 |
| 1556 | 19.342 |
| 1557 | 19.342 |
| 1558 | 19.346 |
| 1559 | 19.344 |
| 1560 | 19.342 |
| 1561 | 19.342 |
| 1562 | 19.342 |
| 1563 | 19.342 |
| 1564 | 19.342 |
| 1565 | 19.342 |
| 1566 | 19.342 |
| 1567 | 19.344 |
| 1568 | 19.346 |
| 1569 | 19.342 |